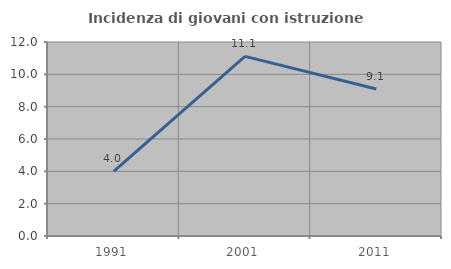
| Category | Incidenza di giovani con istruzione universitaria |
|---|---|
| 1991.0 | 4 |
| 2001.0 | 11.111 |
| 2011.0 | 9.091 |